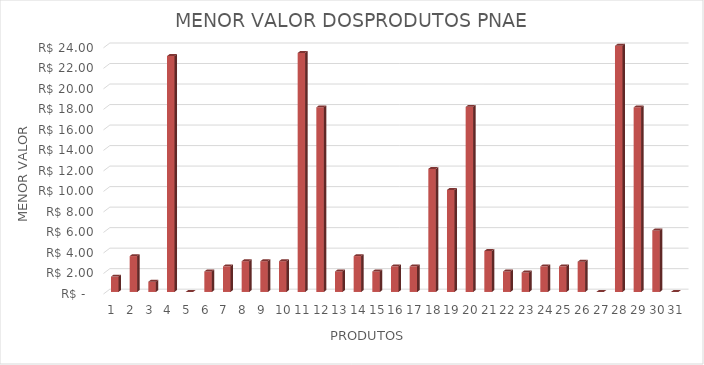
| Category | Series 0 |
|---|---|
| 0 | 1.5 |
| 1 | 3.5 |
| 2 | 1 |
| 3 | 23 |
| 4 | 0 |
| 5 | 2 |
| 6 | 2.5 |
| 7 | 3 |
| 8 | 3 |
| 9 | 3 |
| 10 | 23.3 |
| 11 | 18 |
| 12 | 2 |
| 13 | 3.5 |
| 14 | 2 |
| 15 | 2.5 |
| 16 | 2.5 |
| 17 | 12 |
| 18 | 9.95 |
| 19 | 18.05 |
| 20 | 4 |
| 21 | 2 |
| 22 | 1.9 |
| 23 | 2.5 |
| 24 | 2.5 |
| 25 | 2.95 |
| 26 | 0 |
| 27 | 45 |
| 28 | 18 |
| 29 | 6 |
| 30 | 0 |